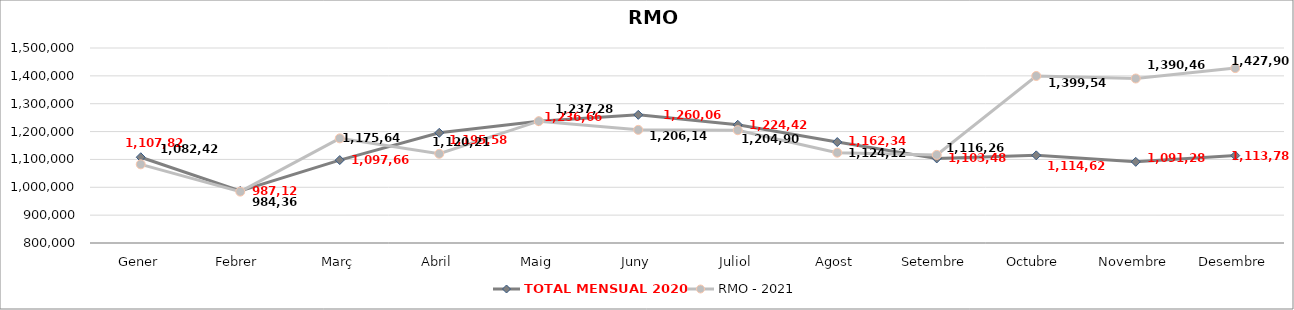
| Category | TOTAL MENSUAL 2020 | RMO - 2021 |
|---|---|---|
| Gener | 1107820 | 1082420 |
| Febrer | 987120 | 984360.01 |
| Març | 1097660 | 1175640 |
| Abril | 1195580 | 1120218 |
| Maig | 1236660 | 1237280 |
| Juny | 1260060.1 | 1206140 |
| Juliol | 1224420 | 1204900 |
| Agost | 1162340 | 1124120 |
| Setembre | 1103480 | 1116260 |
| Octubre | 1114620 | 1399540 |
| Novembre | 1091280 | 1390460 |
| Desembre | 1113780 | 1427900 |